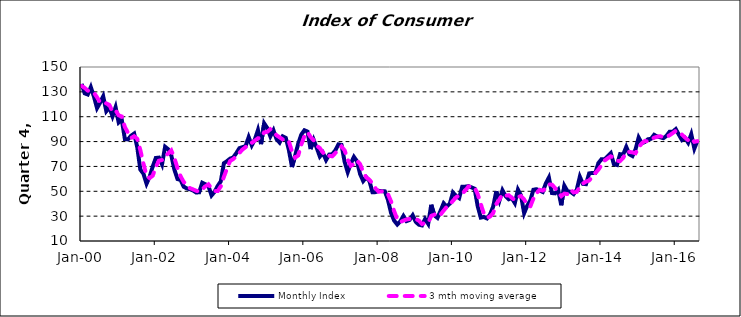
| Category | Monthly Index | 3 mth moving average |
|---|---|---|
| 2000-01-01 | 136.39 | 134.769 |
| 2000-02-01 | 128.83 | 133.196 |
| 2000-03-01 | 127.87 | 131.03 |
| 2000-04-01 | 133.808 | 130.17 |
| 2000-05-01 | 126.234 | 129.304 |
| 2000-06-01 | 116.898 | 125.647 |
| 2000-07-01 | 121.315 | 121.482 |
| 2000-08-01 | 126.388 | 121.534 |
| 2000-09-01 | 114.421 | 120.708 |
| 2000-10-01 | 117.451 | 119.42 |
| 2000-11-01 | 110.366 | 114.079 |
| 2000-12-01 | 117.635 | 115.151 |
| 2001-01-01 | 105.36 | 111.12 |
| 2001-02-01 | 107.559 | 110.184 |
| 2001-03-01 | 92.035 | 101.651 |
| 2001-04-01 | 91.744 | 97.113 |
| 2001-05-01 | 94.719 | 92.833 |
| 2001-06-01 | 96.453 | 94.305 |
| 2001-07-01 | 85.411 | 92.194 |
| 2001-08-01 | 67.414 | 83.093 |
| 2001-09-01 | 64.075 | 72.3 |
| 2001-10-01 | 56.085 | 62.525 |
| 2001-11-01 | 61.702 | 60.621 |
| 2001-12-01 | 69.937 | 62.575 |
| 2002-01-01 | 76.81 | 69.483 |
| 2002-02-01 | 77.08 | 74.609 |
| 2002-03-01 | 71.629 | 75.173 |
| 2002-04-01 | 85.831 | 78.18 |
| 2002-05-01 | 83.795 | 80.418 |
| 2002-06-01 | 78.905 | 82.844 |
| 2002-07-01 | 67.374 | 76.691 |
| 2002-08-01 | 59.832 | 68.703 |
| 2002-09-01 | 59.111 | 62.105 |
| 2002-10-01 | 53.696 | 57.546 |
| 2002-11-01 | 52.312 | 55.04 |
| 2002-12-01 | 51.679 | 52.562 |
| 2003-01-01 | 50.696 | 51.562 |
| 2003-02-01 | 49.029 | 50.468 |
| 2003-03-01 | 49.193 | 49.639 |
| 2003-04-01 | 56.879 | 51.7 |
| 2003-05-01 | 55.689 | 53.92 |
| 2003-06-01 | 54.224 | 55.598 |
| 2003-07-01 | 46.672 | 52.195 |
| 2003-08-01 | 49.648 | 50.182 |
| 2003-09-01 | 54.366 | 50.229 |
| 2003-10-01 | 58.069 | 54.028 |
| 2003-11-01 | 72.593 | 61.676 |
| 2003-12-01 | 74.28 | 68.314 |
| 2004-01-01 | 76.295 | 74.389 |
| 2004-02-01 | 77.202 | 75.925 |
| 2004-03-01 | 80.7 | 78.065 |
| 2004-04-01 | 84.661 | 80.854 |
| 2004-05-01 | 85.54 | 83.634 |
| 2004-06-01 | 86.268 | 85.49 |
| 2004-07-01 | 93.601 | 88.47 |
| 2004-08-01 | 86.964 | 88.944 |
| 2004-09-01 | 91.735 | 90.767 |
| 2004-10-01 | 99.325 | 92.675 |
| 2004-11-01 | 87.933 | 92.998 |
| 2004-12-01 | 104.713 | 97.324 |
| 2005-01-01 | 100.93 | 97.859 |
| 2005-02-01 | 94.183 | 99.942 |
| 2005-03-01 | 99.126 | 98.08 |
| 2005-04-01 | 91.93 | 95.08 |
| 2005-05-01 | 89.176 | 93.411 |
| 2005-06-01 | 94.185 | 91.764 |
| 2005-07-01 | 92.95 | 92.104 |
| 2005-08-01 | 83.038 | 90.058 |
| 2005-09-01 | 69.518 | 81.835 |
| 2005-10-01 | 78.597 | 77.051 |
| 2005-11-01 | 88.285 | 78.8 |
| 2005-12-01 | 95.591 | 87.491 |
| 2006-01-01 | 99.091 | 94.322 |
| 2006-02-01 | 98.049 | 97.577 |
| 2006-03-01 | 83.987 | 93.709 |
| 2006-04-01 | 91.366 | 91.134 |
| 2006-05-01 | 84.819 | 86.724 |
| 2006-06-01 | 77.945 | 84.71 |
| 2006-07-01 | 80.872 | 81.212 |
| 2006-08-01 | 75.132 | 77.983 |
| 2006-09-01 | 79.536 | 78.513 |
| 2006-10-01 | 79.805 | 78.158 |
| 2006-11-01 | 82.924 | 80.755 |
| 2006-12-01 | 87.744 | 83.491 |
| 2007-01-01 | 87.327 | 85.998 |
| 2007-02-01 | 73.76 | 82.944 |
| 2007-03-01 | 65.391 | 75.493 |
| 2007-04-01 | 72.362 | 70.505 |
| 2007-05-01 | 77.669 | 71.807 |
| 2007-06-01 | 74.125 | 74.719 |
| 2007-07-01 | 63.876 | 71.89 |
| 2007-08-01 | 58.244 | 65.415 |
| 2007-09-01 | 61.25 | 61.123 |
| 2007-10-01 | 58.415 | 59.303 |
| 2007-11-01 | 49.237 | 56.301 |
| 2007-12-01 | 49.329 | 52.327 |
| 2008-01-01 | 50.379 | 49.648 |
| 2008-02-01 | 50.116 | 49.941 |
| 2008-03-01 | 49.951 | 50.149 |
| 2008-04-01 | 43.093 | 47.72 |
| 2008-05-01 | 32.628 | 41.891 |
| 2008-06-01 | 26.435 | 34.052 |
| 2008-07-01 | 23.287 | 27.45 |
| 2008-08-01 | 25.847 | 25.19 |
| 2008-09-01 | 30.157 | 26.43 |
| 2008-10-01 | 26.003 | 27.336 |
| 2008-11-01 | 26.977 | 27.712 |
| 2008-12-01 | 30.712 | 27.897 |
| 2009-01-01 | 25.335 | 27.674 |
| 2009-02-01 | 23.103 | 26.383 |
| 2009-03-01 | 22.534 | 23.657 |
| 2009-04-01 | 27.683 | 24.44 |
| 2009-05-01 | 23.806 | 24.674 |
| 2009-06-01 | 39.148 | 30.212 |
| 2009-07-01 | 30.628 | 31.194 |
| 2009-08-01 | 28.613 | 32.796 |
| 2009-09-01 | 34.385 | 31.209 |
| 2009-10-01 | 40.397 | 34.465 |
| 2009-11-01 | 37.75 | 37.51 |
| 2009-12-01 | 40.104 | 39.417 |
| 2010-01-01 | 49.048 | 42.3 |
| 2010-02-01 | 46.301 | 45.151 |
| 2010-03-01 | 44.527 | 46.625 |
| 2010-04-01 | 53.697 | 48.175 |
| 2010-05-01 | 53.722 | 50.649 |
| 2010-06-01 | 54.141 | 53.853 |
| 2010-07-01 | 53.128 | 53.664 |
| 2010-08-01 | 52.073 | 53.114 |
| 2010-09-01 | 37.939 | 47.713 |
| 2010-10-01 | 28.832 | 39.615 |
| 2010-11-01 | 29.359 | 32.043 |
| 2010-12-01 | 28.144 | 28.778 |
| 2011-01-01 | 31.502 | 29.669 |
| 2011-02-01 | 37.76 | 32.469 |
| 2011-03-01 | 49.903 | 39.722 |
| 2011-04-01 | 42.321 | 43.328 |
| 2011-05-01 | 50.793 | 47.672 |
| 2011-06-01 | 46.185 | 46.433 |
| 2011-07-01 | 43.574 | 46.851 |
| 2011-08-01 | 44.527 | 44.762 |
| 2011-09-01 | 40.487 | 42.863 |
| 2011-10-01 | 51.323 | 45.446 |
| 2011-11-01 | 46.574 | 46.128 |
| 2011-12-01 | 32.391 | 43.43 |
| 2012-01-01 | 38.392 | 39.119 |
| 2012-02-01 | 42.713 | 37.832 |
| 2012-03-01 | 51.243 | 44.116 |
| 2012-04-01 | 51.686 | 48.547 |
| 2012-05-01 | 50.586 | 51.172 |
| 2012-06-01 | 49.468 | 50.58 |
| 2012-07-01 | 56.291 | 52.115 |
| 2012-08-01 | 61.037 | 55.598 |
| 2012-09-01 | 48.567 | 55.298 |
| 2012-10-01 | 48.352 | 52.652 |
| 2012-11-01 | 51.207 | 49.375 |
| 2012-12-01 | 38.751 | 46.103 |
| 2013-01-01 | 54.431 | 48.13 |
| 2013-02-01 | 50.041 | 47.741 |
| 2013-03-01 | 49.547 | 51.34 |
| 2013-04-01 | 47.738 | 49.109 |
| 2013-05-01 | 51.26 | 49.515 |
| 2013-06-01 | 61.712 | 53.57 |
| 2013-07-01 | 55.932 | 56.301 |
| 2013-08-01 | 55.724 | 57.789 |
| 2013-09-01 | 64.359 | 58.671 |
| 2013-10-01 | 64.772 | 61.618 |
| 2013-11-01 | 64.842 | 64.658 |
| 2013-12-01 | 72.727 | 67.447 |
| 2014-01-01 | 75.834 | 71.134 |
| 2014-02-01 | 75.611 | 74.724 |
| 2014-03-01 | 78.122 | 76.522 |
| 2014-04-01 | 80.645 | 78.126 |
| 2014-05-01 | 71.833 | 76.867 |
| 2014-06-01 | 71.162 | 74.547 |
| 2014-07-01 | 79.884 | 74.293 |
| 2014-08-01 | 79.606 | 76.884 |
| 2014-09-01 | 85.707 | 81.732 |
| 2014-10-01 | 79.749 | 81.687 |
| 2014-11-01 | 78.367 | 81.274 |
| 2014-12-01 | 83.755 | 80.623 |
| 2015-01-01 | 93.238 | 85.12 |
| 2015-02-01 | 88.642 | 88.545 |
| 2015-03-01 | 89.649 | 90.51 |
| 2015-04-01 | 91.839 | 90.043 |
| 2015-05-01 | 92.205 | 91.231 |
| 2015-06-01 | 95.411 | 93.152 |
| 2015-07-01 | 94.108 | 93.908 |
| 2015-08-01 | 93.4 | 94.306 |
| 2015-09-01 | 92.702 | 93.403 |
| 2015-10-01 | 94.614 | 93.572 |
| 2015-11-01 | 97.924 | 95.08 |
| 2015-12-01 | 97.892 | 96.81 |
| 2016-01-01 | 100.031 | 98.616 |
| 2016-02-01 | 95.541 | 97.821 |
| 2016-03-01 | 91.207 | 95.593 |
| 2016-04-01 | 92.927 | 93.225 |
| 2016-05-01 | 89.076 | 91.07 |
| 2016-06-01 | 95.91 | 92.638 |
| 2016-07-01 | 84.409 | 89.798 |
| 2016-08-01 | 90.774 | 90.364 |